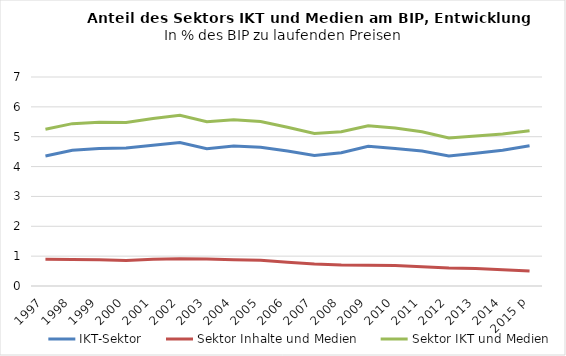
| Category | IKT-Sektor | Sektor Inhalte und Medien | Sektor IKT und Medien |
|---|---|---|---|
| 1997 | 4.355 | 0.894 | 5.249 |
| 1998 | 4.547 | 0.891 | 5.438 |
| 1999 | 4.606 | 0.876 | 5.483 |
| 2000 | 4.62 | 0.853 | 5.474 |
| 2001 | 4.715 | 0.894 | 5.61 |
| 2002 | 4.806 | 0.913 | 5.72 |
| 2003 | 4.597 | 0.908 | 5.505 |
| 2004 | 4.692 | 0.88 | 5.572 |
| 2005 | 4.645 | 0.864 | 5.508 |
| 2006 | 4.52 | 0.798 | 5.318 |
| 2007 | 4.371 | 0.74 | 5.111 |
| 2008 | 4.46 | 0.705 | 5.165 |
| 2009 | 4.676 | 0.693 | 5.369 |
| 2010 | 4.603 | 0.686 | 5.289 |
| 2011 | 4.52 | 0.645 | 5.164 |
| 2012 | 4.356 | 0.601 | 4.957 |
| 2013 | 4.442 | 0.583 | 5.025 |
| 2014 | 4.546 | 0.548 | 5.095 |
| 2015 p | 4.699 | 0.504 | 5.203 |